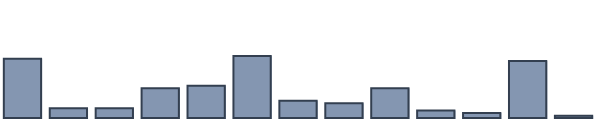
| Category | Series 0 |
|---|---|
| 0 | 17.6 |
| 1 | 2.9 |
| 2 | 2.9 |
| 3 | 8.8 |
| 4 | 9.6 |
| 5 | 18.4 |
| 6 | 5.1 |
| 7 | 4.4 |
| 8 | 8.8 |
| 9 | 2.2 |
| 10 | 1.5 |
| 11 | 16.9 |
| 12 | 0.7 |